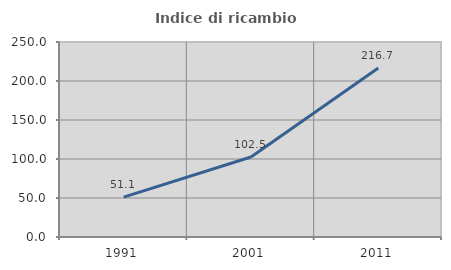
| Category | Indice di ricambio occupazionale  |
|---|---|
| 1991.0 | 51.111 |
| 2001.0 | 102.5 |
| 2011.0 | 216.667 |